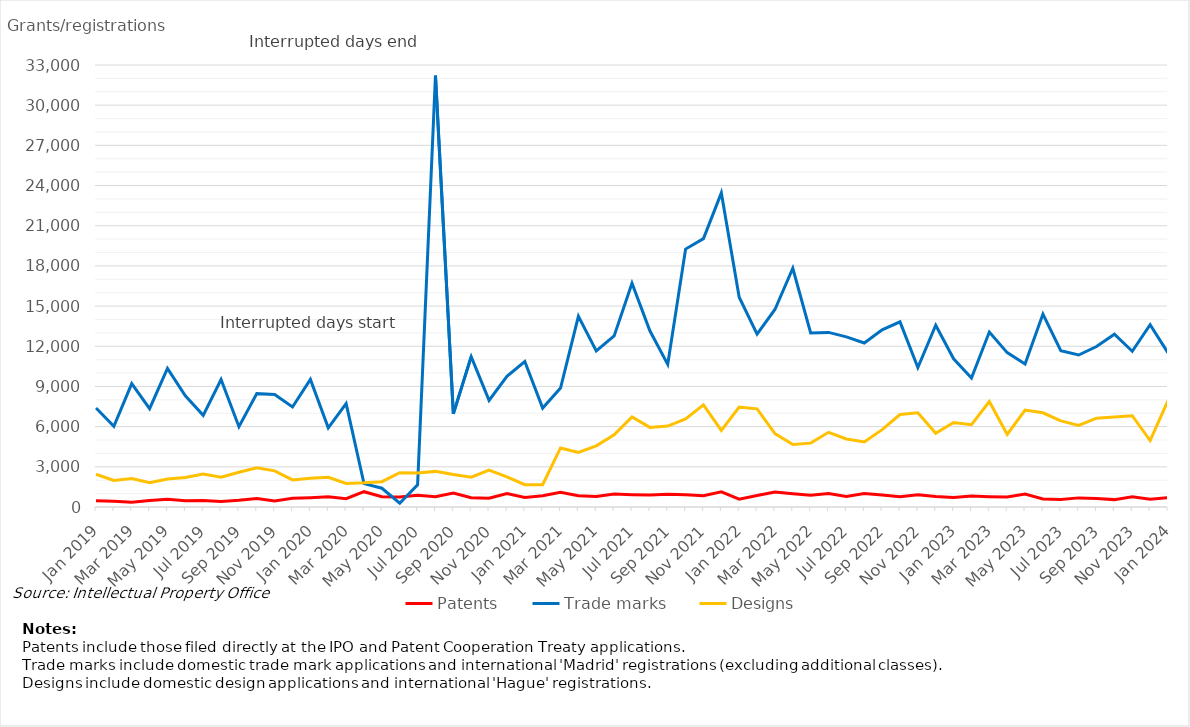
| Category | Patents | Trade marks | Designs |
|---|---|---|---|
| Jan 2019 | 474 | 7396 | 2444 |
| Feb 2019 | 426 | 6023 | 1987 |
| Mar 2019 | 363 | 9208 | 2125 |
| Apr 2019 | 488 | 7341 | 1810 |
| May 2019 | 573 | 10347 | 2096 |
| Jun 2019 | 471 | 8305 | 2202 |
| Jul 2019 | 489 | 6841 | 2464 |
| Aug 2019 | 420 | 9519 | 2218 |
| Sep 2019 | 500 | 5992 | 2596 |
| Oct 2019 | 634 | 8464 | 2926 |
| Nov 2019 | 455 | 8405 | 2700 |
| Dec 2019 | 654 | 7470 | 2021 |
| Jan 2020 | 696 | 9528 | 2145 |
| Feb 2020 | 756 | 5911 | 2219 |
| Mar 2020 | 622 | 7723 | 1757 |
| Apr 2020 | 1143 | 1744 | 1803 |
| May 2020 | 768 | 1401 | 1888 |
| Jun 2020 | 740 | 282 | 2564 |
| Jul 2020 | 878 | 1661 | 2539 |
| Aug 2020 | 771 | 32206 | 2659 |
| Sep 2020 | 1042 | 6950 | 2425 |
| Oct 2020 | 697 | 11228 | 2223 |
| Nov 2020 | 649 | 7958 | 2763 |
| Dec 2020 | 1010 | 9754 | 2252 |
| Jan 2021 | 708 | 10859 | 1665 |
| Feb 2021 | 838 | 7384 | 1660 |
| Mar 2021 | 1107 | 8880 | 4408 |
| Apr 2021 | 838 | 14237 | 4074 |
| May 2021 | 788 | 11656 | 4562 |
| Jun 2021 | 972 | 12776 | 5385 |
| Jul 2021 | 918 | 16702 | 6731 |
| Aug 2021 | 887 | 13153 | 5944 |
| Sep 2021 | 947 | 10651 | 6041 |
| Oct 2021 | 920 | 19257 | 6577 |
| Nov 2021 | 841 | 20035 | 7629 |
| Dec 2021 | 1131 | 23453 | 5719 |
| Jan 2022 | 585 | 15666 | 7455 |
| Feb 2022 | 860 | 12902 | 7329 |
| Mar 2022 | 1111 | 14746 | 5482 |
| Apr 2022 | 990 | 17825 | 4662 |
| May 2022 | 883 | 12999 | 4767 |
| Jun 2022 | 1010 | 13037 | 5577 |
| Jul 2022 | 788 | 12704 | 5082 |
| Aug 2022 | 1007 | 12242 | 4856 |
| Sep 2022 | 889 | 13232 | 5776 |
| Oct 2022 | 758 | 13824 | 6904 |
| Nov 2022 | 920 | 10408 | 7027 |
| Dec 2022 | 777 | 13567 | 5498 |
| Jan 2023 | 708 | 11068 | 6304 |
| Feb 2023 | 817 | 9628 | 6141 |
| Mar 2023 | 770 | 13066 | 7872 |
| Apr 2023 | 747 | 11525 | 5420 |
| May 2023 | 963 | 10679 | 7237 |
| Jun 2023 | 606 | 14401 | 7032 |
| Jul 2023 | 561 | 11673 | 6425 |
| Aug 2023 | 681 | 11348 | 6095 |
| Sep 2023 | 638 | 11980 | 6631 |
| Oct 2023 | 551 | 12896 | 6727 |
| Nov 2023 | 762 | 11630 | 6814 |
| Dec 2023 | 573 | 13615 | 4964 |
| Jan 2024 | 694 | 11502 | 7940 |